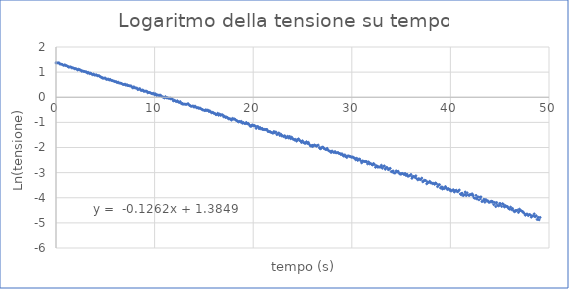
| Category | Series 0 |
|---|---|
| 0.0 | 1.364 |
| 0.1 | 1.367 |
| 0.2 | 1.366 |
| 0.3 | 1.371 |
| 0.4 | 1.319 |
| 0.5 | 1.319 |
| 0.6 | 1.311 |
| 0.7 | 1.286 |
| 0.8 | 1.267 |
| 0.9 | 1.293 |
| 1.0 | 1.258 |
| 1.1 | 1.255 |
| 1.2 | 1.225 |
| 1.3 | 1.196 |
| 1.4 | 1.209 |
| 1.5 | 1.208 |
| 1.6 | 1.17 |
| 1.7 | 1.172 |
| 1.8 | 1.158 |
| 1.9 | 1.134 |
| 2.0 | 1.137 |
| 2.1 | 1.123 |
| 2.2 | 1.085 |
| 2.3 | 1.115 |
| 2.4 | 1.091 |
| 2.5 | 1.082 |
| 2.6 | 1.038 |
| 2.7 | 1.048 |
| 2.8 | 1.029 |
| 2.9 | 1.024 |
| 3.0 | 1.011 |
| 3.1 | 1.008 |
| 3.2 | 0.961 |
| 3.3 | 0.988 |
| 3.4 | 0.94 |
| 3.5 | 0.958 |
| 3.6 | 0.939 |
| 3.7 | 0.897 |
| 3.8 | 0.923 |
| 3.9 | 0.882 |
| 4.0 | 0.885 |
| 4.1 | 0.891 |
| 4.2 | 0.856 |
| 4.3 | 0.858 |
| 4.4 | 0.852 |
| 4.5 | 0.808 |
| 4.6 | 0.796 |
| 4.7 | 0.761 |
| 4.8 | 0.759 |
| 4.9 | 0.761 |
| 5.0 | 0.762 |
| 5.1 | 0.711 |
| 5.2 | 0.717 |
| 5.3 | 0.723 |
| 5.4 | 0.685 |
| 5.5 | 0.709 |
| 5.6 | 0.671 |
| 5.7 | 0.664 |
| 5.8 | 0.65 |
| 5.9 | 0.639 |
| 6.0 | 0.618 |
| 6.1 | 0.621 |
| 6.2 | 0.584 |
| 6.3 | 0.603 |
| 6.4 | 0.562 |
| 6.5 | 0.565 |
| 6.6 | 0.554 |
| 6.7 | 0.534 |
| 6.8 | 0.508 |
| 6.9 | 0.51 |
| 7.0 | 0.523 |
| 7.1 | 0.475 |
| 7.2 | 0.501 |
| 7.3 | 0.461 |
| 7.4 | 0.463 |
| 7.5 | 0.446 |
| 7.6 | 0.455 |
| 7.7 | 0.407 |
| 7.8 | 0.369 |
| 7.9 | 0.416 |
| 8.0 | 0.376 |
| 8.1 | 0.364 |
| 8.2 | 0.368 |
| 8.3 | 0.303 |
| 8.4 | 0.326 |
| 8.5 | 0.344 |
| 8.6 | 0.279 |
| 8.7 | 0.269 |
| 8.8 | 0.289 |
| 8.9 | 0.237 |
| 9.0 | 0.239 |
| 9.1 | 0.242 |
| 9.2 | 0.24 |
| 9.3 | 0.178 |
| 9.4 | 0.193 |
| 9.5 | 0.187 |
| 9.6 | 0.172 |
| 9.7 | 0.148 |
| 9.8 | 0.139 |
| 9.9 | 0.157 |
| 10.0 | 0.097 |
| 10.1 | 0.136 |
| 10.2 | 0.074 |
| 10.3 | 0.093 |
| 10.4 | 0.076 |
| 10.5 | 0.078 |
| 10.6 | 0.08 |
| 10.7 | 0.037 |
| 10.8 | 0.015 |
| 10.9 | 0.002 |
| 11.0 | -0.027 |
| 11.1 | 0.023 |
| 11.2 | -0.02 |
| 11.3 | -0.018 |
| 11.4 | -0.037 |
| 11.5 | -0.042 |
| 11.6 | -0.038 |
| 11.7 | -0.051 |
| 11.8 | -0.068 |
| 11.9 | -0.144 |
| 12.0 | -0.122 |
| 12.1 | -0.145 |
| 12.2 | -0.172 |
| 12.3 | -0.141 |
| 12.4 | -0.188 |
| 12.5 | -0.206 |
| 12.6 | -0.174 |
| 12.7 | -0.246 |
| 12.8 | -0.27 |
| 12.9 | -0.275 |
| 13.0 | -0.272 |
| 13.1 | -0.277 |
| 13.2 | -0.285 |
| 13.3 | -0.271 |
| 13.4 | -0.256 |
| 13.5 | -0.311 |
| 13.6 | -0.333 |
| 13.7 | -0.364 |
| 13.8 | -0.351 |
| 13.9 | -0.347 |
| 14.0 | -0.395 |
| 14.1 | -0.352 |
| 14.2 | -0.396 |
| 14.3 | -0.427 |
| 14.4 | -0.41 |
| 14.5 | -0.445 |
| 14.6 | -0.425 |
| 14.7 | -0.461 |
| 14.8 | -0.481 |
| 14.9 | -0.51 |
| 15.0 | -0.511 |
| 15.1 | -0.534 |
| 15.2 | -0.498 |
| 15.3 | -0.531 |
| 15.4 | -0.509 |
| 15.5 | -0.558 |
| 15.6 | -0.54 |
| 15.7 | -0.588 |
| 15.8 | -0.621 |
| 15.9 | -0.6 |
| 16.0 | -0.637 |
| 16.1 | -0.64 |
| 16.2 | -0.688 |
| 16.3 | -0.692 |
| 16.4 | -0.639 |
| 16.5 | -0.718 |
| 16.6 | -0.67 |
| 16.7 | -0.715 |
| 16.8 | -0.7 |
| 16.9 | -0.7 |
| 17.0 | -0.777 |
| 17.1 | -0.758 |
| 17.2 | -0.805 |
| 17.3 | -0.788 |
| 17.4 | -0.814 |
| 17.5 | -0.858 |
| 17.6 | -0.855 |
| 17.7 | -0.866 |
| 17.8 | -0.91 |
| 17.9 | -0.842 |
| 18.0 | -0.871 |
| 18.1 | -0.864 |
| 18.2 | -0.891 |
| 18.3 | -0.926 |
| 18.4 | -0.946 |
| 18.5 | -0.982 |
| 18.6 | -0.965 |
| 18.7 | -0.986 |
| 18.8 | -0.961 |
| 18.9 | -1.033 |
| 19.0 | -1.008 |
| 19.1 | -1.04 |
| 19.2 | -1.048 |
| 19.3 | -1.004 |
| 19.4 | -1.056 |
| 19.5 | -1.043 |
| 19.6 | -1.093 |
| 19.7 | -1.155 |
| 19.8 | -1.154 |
| 19.9 | -1.1 |
| 20.0 | -1.134 |
| 20.1 | -1.121 |
| 20.2 | -1.147 |
| 20.3 | -1.238 |
| 20.4 | -1.162 |
| 20.5 | -1.172 |
| 20.6 | -1.25 |
| 20.7 | -1.206 |
| 20.8 | -1.266 |
| 20.9 | -1.235 |
| 21.0 | -1.291 |
| 21.1 | -1.272 |
| 21.2 | -1.296 |
| 21.3 | -1.277 |
| 21.4 | -1.284 |
| 21.5 | -1.364 |
| 21.6 | -1.36 |
| 21.7 | -1.38 |
| 21.8 | -1.396 |
| 21.9 | -1.41 |
| 22.0 | -1.433 |
| 22.1 | -1.365 |
| 22.2 | -1.412 |
| 22.3 | -1.381 |
| 22.4 | -1.487 |
| 22.5 | -1.452 |
| 22.6 | -1.42 |
| 22.7 | -1.521 |
| 22.8 | -1.467 |
| 22.9 | -1.541 |
| 23.0 | -1.533 |
| 23.1 | -1.568 |
| 23.2 | -1.532 |
| 23.3 | -1.615 |
| 23.4 | -1.606 |
| 23.5 | -1.554 |
| 23.6 | -1.621 |
| 23.7 | -1.562 |
| 23.8 | -1.648 |
| 23.9 | -1.59 |
| 24.0 | -1.66 |
| 24.1 | -1.667 |
| 24.2 | -1.704 |
| 24.3 | -1.678 |
| 24.4 | -1.748 |
| 24.5 | -1.691 |
| 24.6 | -1.656 |
| 24.7 | -1.721 |
| 24.8 | -1.736 |
| 24.9 | -1.8 |
| 25.0 | -1.735 |
| 25.1 | -1.8 |
| 25.2 | -1.828 |
| 25.3 | -1.834 |
| 25.4 | -1.771 |
| 25.5 | -1.838 |
| 25.6 | -1.796 |
| 25.7 | -1.879 |
| 25.8 | -1.936 |
| 25.9 | -1.927 |
| 26.0 | -1.96 |
| 26.1 | -1.94 |
| 26.2 | -1.899 |
| 26.3 | -1.92 |
| 26.4 | -1.948 |
| 26.5 | -1.918 |
| 26.6 | -1.906 |
| 26.7 | -2.007 |
| 26.8 | -2.052 |
| 26.9 | -2.034 |
| 27.0 | -1.983 |
| 27.1 | -1.992 |
| 27.2 | -2.039 |
| 27.3 | -2.068 |
| 27.4 | -2.085 |
| 27.5 | -2.033 |
| 27.6 | -2.108 |
| 27.7 | -2.138 |
| 27.8 | -2.151 |
| 27.9 | -2.198 |
| 28.0 | -2.139 |
| 28.1 | -2.181 |
| 28.2 | -2.2 |
| 28.3 | -2.163 |
| 28.4 | -2.212 |
| 28.5 | -2.214 |
| 28.6 | -2.197 |
| 28.7 | -2.235 |
| 28.8 | -2.242 |
| 28.9 | -2.281 |
| 29.0 | -2.249 |
| 29.1 | -2.313 |
| 29.2 | -2.346 |
| 29.3 | -2.292 |
| 29.4 | -2.365 |
| 29.5 | -2.396 |
| 29.6 | -2.337 |
| 29.7 | -2.334 |
| 29.8 | -2.358 |
| 29.9 | -2.363 |
| 30.0 | -2.391 |
| 30.1 | -2.375 |
| 30.2 | -2.41 |
| 30.3 | -2.425 |
| 30.4 | -2.489 |
| 30.5 | -2.43 |
| 30.6 | -2.513 |
| 30.7 | -2.47 |
| 30.8 | -2.46 |
| 30.9 | -2.527 |
| 31.0 | -2.609 |
| 31.1 | -2.536 |
| 31.2 | -2.552 |
| 31.3 | -2.558 |
| 31.4 | -2.556 |
| 31.5 | -2.559 |
| 31.6 | -2.652 |
| 31.7 | -2.574 |
| 31.8 | -2.652 |
| 31.9 | -2.633 |
| 32.0 | -2.671 |
| 32.1 | -2.696 |
| 32.2 | -2.637 |
| 32.3 | -2.672 |
| 32.4 | -2.786 |
| 32.5 | -2.728 |
| 32.6 | -2.78 |
| 32.7 | -2.773 |
| 32.8 | -2.777 |
| 32.9 | -2.777 |
| 33.0 | -2.706 |
| 33.1 | -2.826 |
| 33.2 | -2.755 |
| 33.3 | -2.731 |
| 33.4 | -2.867 |
| 33.5 | -2.792 |
| 33.6 | -2.804 |
| 33.7 | -2.881 |
| 33.8 | -2.856 |
| 33.9 | -2.83 |
| 34.0 | -2.958 |
| 34.1 | -2.976 |
| 34.2 | -2.937 |
| 34.3 | -3.016 |
| 34.4 | -3.011 |
| 34.5 | -2.929 |
| 34.6 | -2.974 |
| 34.7 | -2.946 |
| 34.8 | -3.02 |
| 34.9 | -3.061 |
| 35.0 | -3.061 |
| 35.1 | -3.027 |
| 35.2 | -3.042 |
| 35.3 | -3.073 |
| 35.4 | -3.033 |
| 35.5 | -3.111 |
| 35.6 | -3.064 |
| 35.7 | -3.147 |
| 35.8 | -3.133 |
| 35.9 | -3.115 |
| 36.0 | -3.074 |
| 36.1 | -3.227 |
| 36.2 | -3.15 |
| 36.3 | -3.156 |
| 36.4 | -3.185 |
| 36.5 | -3.126 |
| 36.6 | -3.243 |
| 36.7 | -3.289 |
| 36.8 | -3.238 |
| 36.9 | -3.268 |
| 37.0 | -3.28 |
| 37.1 | -3.218 |
| 37.2 | -3.366 |
| 37.3 | -3.335 |
| 37.4 | -3.304 |
| 37.5 | -3.316 |
| 37.6 | -3.445 |
| 37.7 | -3.378 |
| 37.8 | -3.396 |
| 37.9 | -3.347 |
| 38.0 | -3.404 |
| 38.1 | -3.406 |
| 38.2 | -3.439 |
| 38.3 | -3.427 |
| 38.4 | -3.463 |
| 38.5 | -3.411 |
| 38.6 | -3.445 |
| 38.7 | -3.559 |
| 38.8 | -3.489 |
| 38.9 | -3.477 |
| 39.0 | -3.612 |
| 39.1 | -3.574 |
| 39.2 | -3.653 |
| 39.3 | -3.621 |
| 39.4 | -3.635 |
| 39.5 | -3.555 |
| 39.6 | -3.617 |
| 39.7 | -3.675 |
| 39.8 | -3.636 |
| 39.9 | -3.676 |
| 40.0 | -3.722 |
| 40.1 | -3.727 |
| 40.2 | -3.7 |
| 40.3 | -3.682 |
| 40.4 | -3.772 |
| 40.5 | -3.72 |
| 40.6 | -3.701 |
| 40.7 | -3.758 |
| 40.8 | -3.737 |
| 40.9 | -3.692 |
| 41.0 | -3.846 |
| 41.1 | -3.883 |
| 41.2 | -3.824 |
| 41.3 | -3.915 |
| 41.4 | -3.88 |
| 41.5 | -3.771 |
| 41.6 | -3.912 |
| 41.7 | -3.804 |
| 41.8 | -3.889 |
| 41.9 | -3.908 |
| 42.0 | -3.868 |
| 42.1 | -3.888 |
| 42.2 | -3.842 |
| 42.3 | -3.896 |
| 42.4 | -4.004 |
| 42.5 | -4.024 |
| 42.6 | -3.906 |
| 42.7 | -4.052 |
| 42.8 | -3.962 |
| 42.9 | -4.083 |
| 43.0 | -3.979 |
| 43.1 | -3.965 |
| 43.2 | -4.151 |
| 43.3 | -4.129 |
| 43.4 | -4.061 |
| 43.5 | -4.178 |
| 43.6 | -4.073 |
| 43.7 | -4.124 |
| 43.8 | -4.122 |
| 43.9 | -4.181 |
| 44.0 | -4.179 |
| 44.1 | -4.149 |
| 44.2 | -4.139 |
| 44.3 | -4.16 |
| 44.4 | -4.274 |
| 44.5 | -4.188 |
| 44.6 | -4.352 |
| 44.7 | -4.192 |
| 44.8 | -4.302 |
| 44.9 | -4.323 |
| 45.0 | -4.227 |
| 45.1 | -4.24 |
| 45.2 | -4.346 |
| 45.3 | -4.237 |
| 45.4 | -4.274 |
| 45.5 | -4.368 |
| 45.6 | -4.317 |
| 45.7 | -4.345 |
| 45.8 | -4.354 |
| 45.9 | -4.425 |
| 46.0 | -4.455 |
| 46.1 | -4.372 |
| 46.2 | -4.474 |
| 46.3 | -4.426 |
| 46.4 | -4.513 |
| 46.5 | -4.555 |
| 46.6 | -4.529 |
| 46.7 | -4.51 |
| 46.8 | -4.494 |
| 46.9 | -4.585 |
| 47.0 | -4.454 |
| 47.1 | -4.5 |
| 47.2 | -4.524 |
| 47.3 | -4.545 |
| 47.4 | -4.577 |
| 47.5 | -4.627 |
| 47.6 | -4.696 |
| 47.7 | -4.659 |
| 47.8 | -4.653 |
| 47.9 | -4.71 |
| 48.0 | -4.669 |
| 48.1 | -4.681 |
| 48.2 | -4.773 |
| 48.3 | -4.724 |
| 48.4 | -4.722 |
| 48.5 | -4.641 |
| 48.6 | -4.758 |
| 48.7 | -4.714 |
| 48.8 | -4.865 |
| 48.9 | -4.784 |
| 49.0 | -4.878 |
| 49.1 | -4.784 |